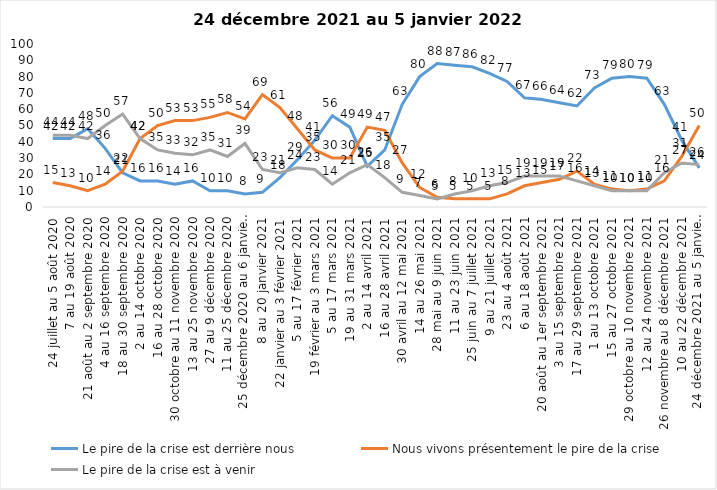
| Category | Le pire de la crise est derrière nous | Nous vivons présentement le pire de la crise | Le pire de la crise est à venir |
|---|---|---|---|
| 24 juillet au 5 août 2020 | 42 | 15 | 44 |
| 7 au 19 août 2020 | 42 | 13 | 44 |
| 21 août au 2 septembre 2020 | 48 | 10 | 42 |
| 4 au 16 septembre 2020 | 36 | 14 | 50 |
| 18 au 30 septembre 2020 | 21 | 22 | 57 |
| 2 au 14 octobre 2020 | 16 | 42 | 42 |
| 16 au 28 octobre 2020 | 16 | 50 | 35 |
| 30 octobre au 11 novembre 2020 | 14 | 53 | 33 |
| 13 au 25 novembre 2020 | 16 | 53 | 32 |
| 27 au 9 décembre 2020 | 10 | 55 | 35 |
| 11 au 25 décembre 2020 | 10 | 58 | 31 |
| 25 décembre 2020 au 6 janvier 2021 | 8 | 54 | 39 |
| 8 au 20 janvier 2021 | 9 | 69 | 23 |
| 22 janvier au 3 février 2021 | 18 | 61 | 21 |
| 5 au 17 février 2021 | 29 | 48 | 24 |
| 19 février au 3 mars 2021 | 41 | 35 | 23 |
| 5 au 17 mars 2021 | 56 | 30 | 14 |
| 19 au 31 mars 2021 | 49 | 30 | 21 |
| 2 au 14 avril 2021 | 25 | 49 | 26 |
| 16 au 28 avril 2021 | 35 | 47 | 18 |
| 30 avril au 12 mai 2021 | 63 | 27 | 9 |
| 14 au 26 mai 2021 | 80 | 12 | 7 |
| 28 mai au 9 juin 2021 | 88 | 6 | 5 |
| 11 au 23 juin 2021 | 87 | 5 | 8 |
| 25 juin au 7 juillet 2021 | 86 | 5 | 10 |
| 9 au 21 juillet 2021 | 82 | 5 | 13 |
| 23 au 4 août 2021 | 77 | 8 | 15 |
| 6 au 18 août 2021 | 67 | 13 | 19 |
| 20 août au 1er septembre 2021 | 66 | 15 | 19 |
| 3 au 15 septembre 2021 | 64 | 17 | 19 |
| 17 au 29 septembre 2021 | 62 | 22 | 16 |
| 1 au 13 octobre 2021 | 73 | 14 | 13 |
| 15 au 27 octobre 2021 | 79 | 11 | 10 |
| 29 octobre au 10 novembre 2021 | 80 | 10 | 10 |
| 12 au 24 novembre 2021 | 79 | 11 | 10 |
| 26 novembre au 8 décembre 2021 | 63 | 16 | 21 |
| 10 au 22 décembre 2021 | 41 | 31 | 27 |
| 24 décembre 2021 au 5 janvier 2022 2022 | 24 | 50 | 26 |